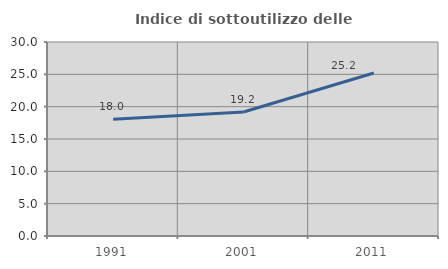
| Category | Indice di sottoutilizzo delle abitazioni  |
|---|---|
| 1991.0 | 18.049 |
| 2001.0 | 19.166 |
| 2011.0 | 25.21 |